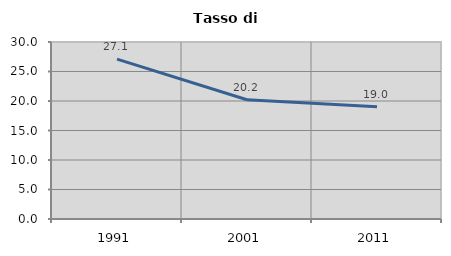
| Category | Tasso di disoccupazione   |
|---|---|
| 1991.0 | 27.091 |
| 2001.0 | 20.221 |
| 2011.0 | 19.033 |